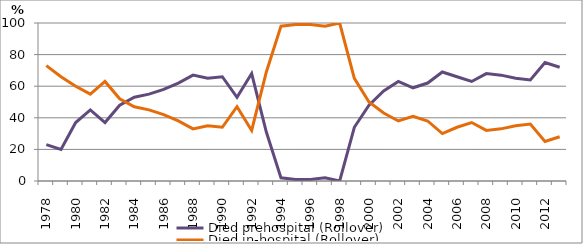
| Category | Died prehospital (Rollover) | Died in-hospital (Rollover) |
|---|---|---|
| 1978.0 | 23 | 73 |
| 1979.0 | 20 | 66 |
| 1980.0 | 37 | 60 |
| 1981.0 | 45 | 55 |
| 1982.0 | 37 | 63 |
| 1983.0 | 48 | 52 |
| 1984.0 | 53 | 47 |
| 1985.0 | 55 | 45 |
| 1986.0 | 58 | 42 |
| 1987.0 | 62 | 38 |
| 1988.0 | 67 | 33 |
| 1989.0 | 65 | 35 |
| 1990.0 | 66 | 34 |
| 1991.0 | 53 | 47 |
| 1992.0 | 68 | 32 |
| 1993.0 | 31 | 69 |
| 1994.0 | 2 | 98 |
| 1995.0 | 1 | 99 |
| 1996.0 | 1 | 99 |
| 1997.0 | 2 | 98 |
| 1998.0 | 0 | 100 |
| 1999.0 | 34 | 65 |
| 2000.0 | 48 | 50 |
| 2001.0 | 57 | 43 |
| 2002.0 | 63 | 38 |
| 2003.0 | 59 | 41 |
| 2004.0 | 62 | 38 |
| 2005.0 | 69 | 30 |
| 2006.0 | 66 | 34 |
| 2007.0 | 63 | 37 |
| 2008.0 | 68 | 32 |
| 2009.0 | 67 | 33 |
| 2010.0 | 65 | 35 |
| 2011.0 | 64 | 36 |
| 2012.0 | 75 | 25 |
| 2013.0 | 72 | 28 |